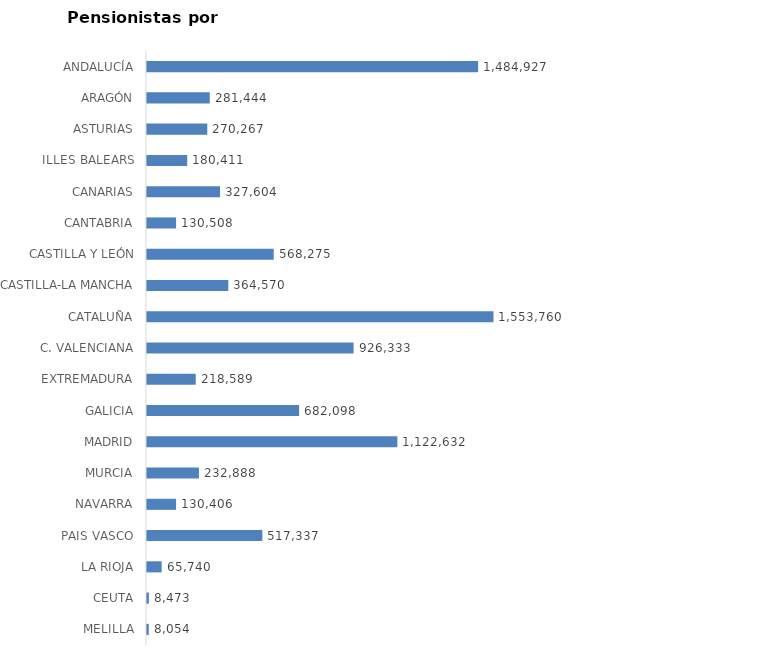
| Category | AMBOS SEXOS (1) |
|---|---|
| ANDALUCÍA | 1484927 |
| ARAGÓN | 281444 |
| ASTURIAS | 270267 |
| ILLES BALEARS | 180411 |
| CANARIAS | 327604 |
| CANTABRIA | 130508 |
| CASTILLA Y LEÓN | 568275 |
| CASTILLA-LA MANCHA | 364570 |
| CATALUÑA | 1553760 |
| C. VALENCIANA | 926333 |
| EXTREMADURA | 218589 |
| GALICIA | 682098 |
| MADRID | 1122632 |
| MURCIA | 232888 |
| NAVARRA | 130406 |
| PAIS VASCO | 517337 |
| LA RIOJA | 65740 |
| CEUTA | 8473 |
| MELILLA | 8054 |